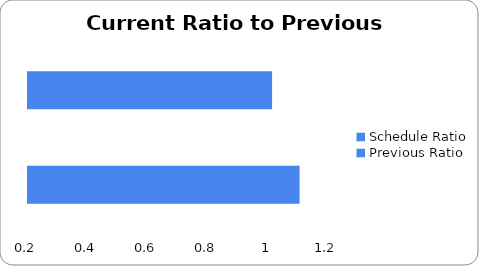
| Category | Series 0 |
|---|---|
| Schedule Ratio | 1.105 |
| Previous Ratio | 1.014 |